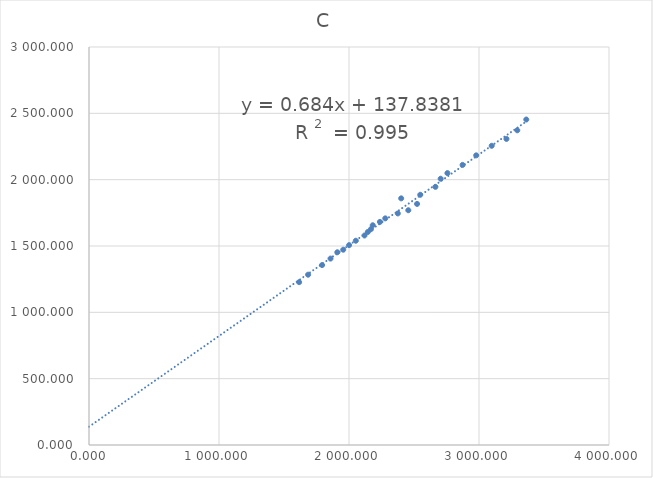
| Category | C |
|---|---|
| 1616.284 | 1227.46 |
| 1685.4479999999999 | 1283.744 |
| 1792.8400000000001 | 1356.328 |
| 1857.729 | 1405.15 |
| 1910.0959999999998 | 1452.745 |
| 1955.703 | 1472.067 |
| 2000.7440000000001 | 1506.556 |
| 2052.438 | 1539.731 |
| 2119.278 | 1579.194 |
| 2144.66 | 1605.514 |
| 2168.237 | 1626.34 |
| 2182.608 | 1656.339 |
| 2237.7270000000003 | 1681.501 |
| 2279.0080000000003 | 1708.261 |
| 2375.563 | 1745.562 |
| 2456.1589999999997 | 1769.445 |
| 2523.5969999999998 | 1817.169 |
| 2401.426 | 1859.095 |
| 2548.0820000000003 | 1886.065 |
| 2664.807 | 1945.935 |
| 2705.06 | 2007.119 |
| 2757.0959999999995 | 2049.454 |
| 2873.722 | 2111.149 |
| 2978.465 | 2183.264 |
| 3097.7 | 2255.336 |
| 3211.283 | 2307.077 |
| 3294.433 | 2372.124 |
| 3363.631 | 2453.318 |